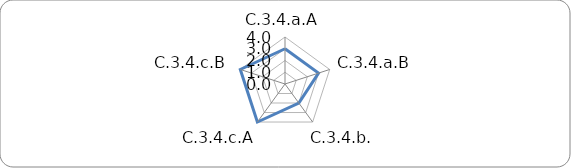
| Category | Series 0 |
|---|---|
| C.3.4.a.A | 3 |
| C.3.4.a.B | 3 |
| C.3.4.b. | 2 |
| C.3.4.c.A | 4 |
| C.3.4.c.B | 4 |